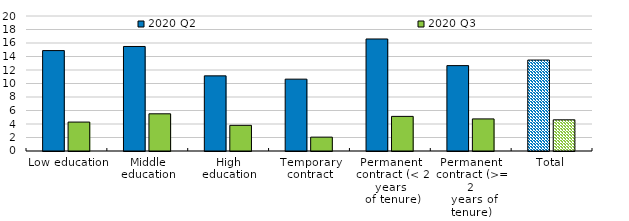
| Category | 2020 Q2 | 2020 Q3 |
|---|---|---|
| Low education | 14.875 | 4.286 |
| Middle education | 15.486 | 5.511 |
| High education | 11.131 | 3.801 |
| Temporary contract | 10.645 | 2.054 |
| Permanent
 contract (< 2 years
 of tenure) | 16.596 | 5.129 |
| Permanent 
contract (>= 2
 years of tenure) | 12.65 | 4.754 |
| Total | 13.476 | 4.622 |